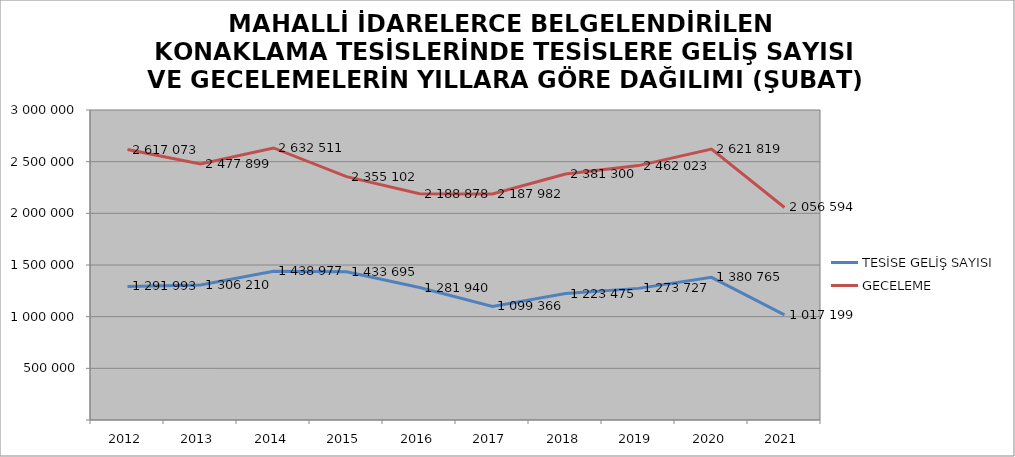
| Category | TESİSE GELİŞ SAYISI | GECELEME |
|---|---|---|
| 2012 | 1291993 | 2617073 |
| 2013 | 1306210 | 2477899 |
| 2014 | 1438977 | 2632511 |
| 2015 | 1433695 | 2355102 |
| 2016 | 1281940 | 2188878 |
| 2017 | 1099366 | 2187982 |
| 2018 | 1223475 | 2381300 |
| 2019 | 1273727 | 2462023 |
| 2020 | 1380765 | 2621819 |
| 2021 | 1017199 | 2056594 |